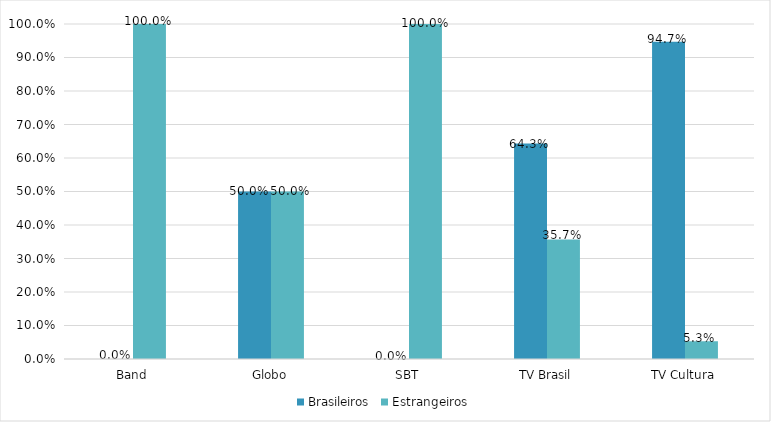
| Category | Brasileiros | Estrangeiros |
|---|---|---|
| Band | 0 | 1 |
| Globo | 0.5 | 0.5 |
| SBT | 0 | 1 |
| TV Brasil | 0.643 | 0.357 |
| TV Cultura | 0.947 | 0.053 |